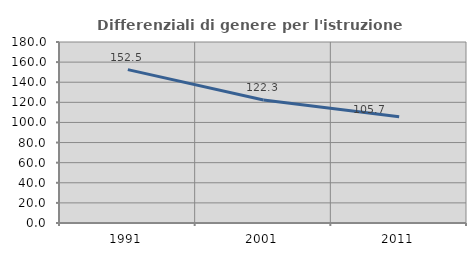
| Category | Differenziali di genere per l'istruzione superiore |
|---|---|
| 1991.0 | 152.521 |
| 2001.0 | 122.298 |
| 2011.0 | 105.71 |